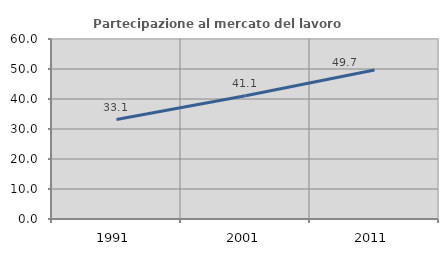
| Category | Partecipazione al mercato del lavoro  femminile |
|---|---|
| 1991.0 | 33.136 |
| 2001.0 | 41.063 |
| 2011.0 | 49.693 |